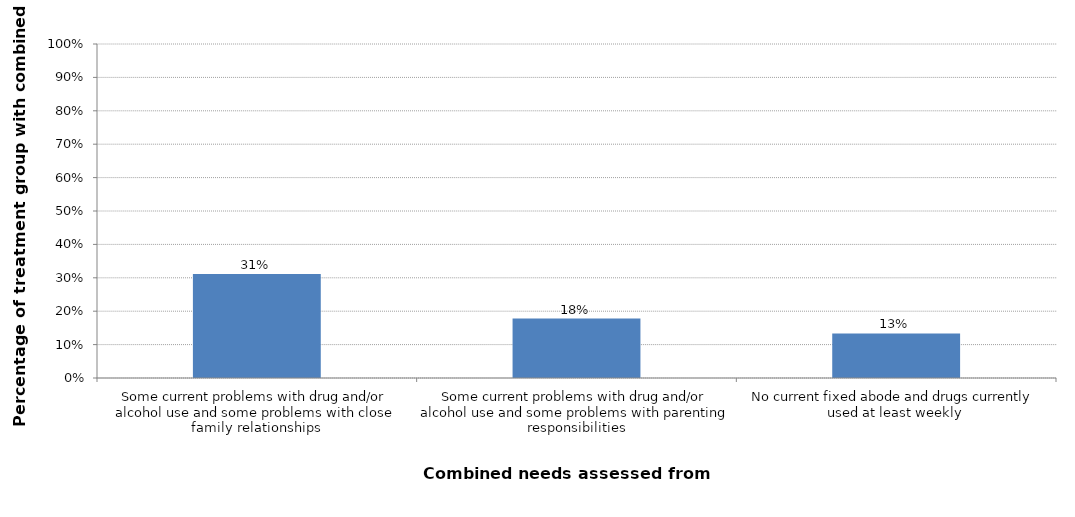
| Category | Percentage of treatment group with combined need |
|---|---|
| Some current problems with drug and/or alcohol use and some problems with close family relationships | 0.311 |
| Some current problems with drug and/or alcohol use and some problems with parenting responsibilities | 0.178 |
| No current fixed abode and drugs currently used at least weekly | 0.133 |